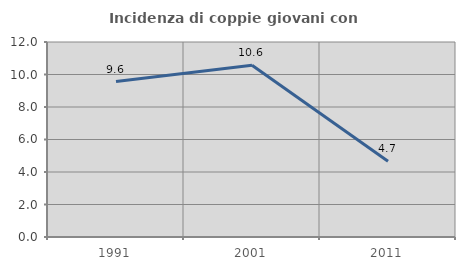
| Category | Incidenza di coppie giovani con figli |
|---|---|
| 1991.0 | 9.562 |
| 2001.0 | 10.563 |
| 2011.0 | 4.661 |